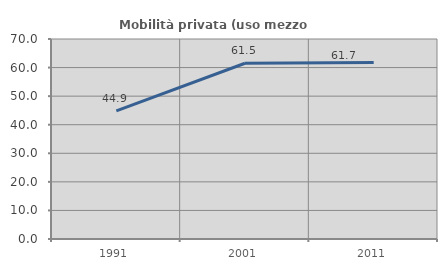
| Category | Mobilità privata (uso mezzo privato) |
|---|---|
| 1991.0 | 44.854 |
| 2001.0 | 61.522 |
| 2011.0 | 61.744 |